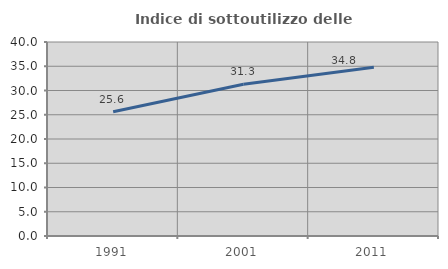
| Category | Indice di sottoutilizzo delle abitazioni  |
|---|---|
| 1991.0 | 25.624 |
| 2001.0 | 31.307 |
| 2011.0 | 34.778 |